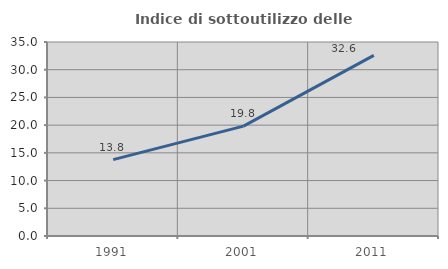
| Category | Indice di sottoutilizzo delle abitazioni  |
|---|---|
| 1991.0 | 13.78 |
| 2001.0 | 19.821 |
| 2011.0 | 32.581 |